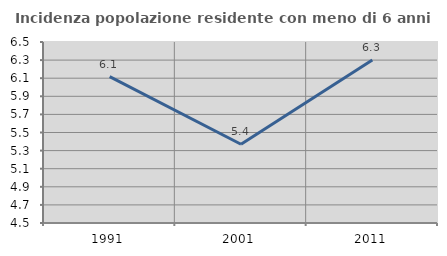
| Category | Incidenza popolazione residente con meno di 6 anni |
|---|---|
| 1991.0 | 6.117 |
| 2001.0 | 5.37 |
| 2011.0 | 6.302 |